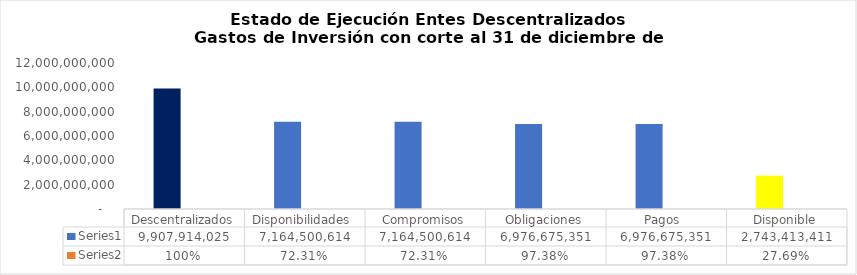
| Category | Series 0 | Series 1 |
|---|---|---|
| Descentralizados | 9907914024.97 | 1 |
| Disponibilidades  | 7164500614.194 | 0.723 |
| Compromisos | 7164500614.194 | 0.723 |
| Obligaciones | 6976675351.263 | 0.974 |
| Pagos  | 6976675351.263 | 0.974 |
| Disponible | 2743413410.776 | 0.277 |